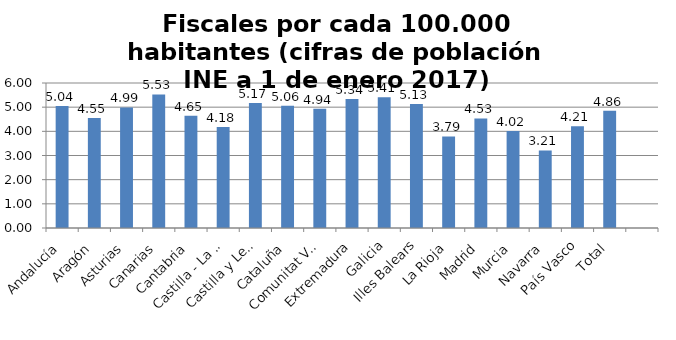
| Category | Fiscales por cada 100.000 habitantes |
|---|---|
| Andalucía | 5.043 |
| Aragón | 4.548 |
| Asturias | 4.986 |
| Canarias | 5.526 |
| Cantabria | 4.647 |
| Castilla - La Mancha | 4.181 |
| Castilla y León | 5.168 |
| Cataluña | 5.055 |
| Comunitat Valenciana | 4.936 |
| Extremadura | 5.339 |
| Galicia | 5.408 |
| Illes Balears | 5.133 |
| La Rioja | 3.788 |
| Madrid | 4.532 |
| Murcia | 4.016 |
| Navarra | 3.21 |
| País Vasco | 4.212 |
| Total | 4.857 |